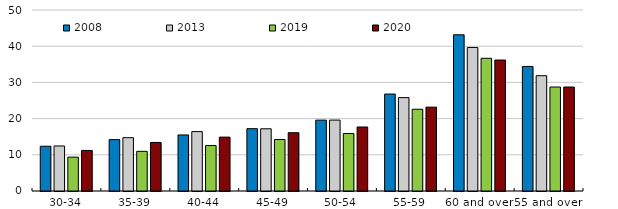
| Category | 2008 | 2013 | 2019 | 2020 |
|---|---|---|---|---|
| 30-34 | 12.366 | 12.436 | 9.356 | 11.207 |
| 35-39 | 14.199 | 14.731 | 10.954 | 13.415 |
| 40-44 | 15.48 | 16.412 | 12.554 | 14.887 |
| 45-49 | 17.217 | 17.185 | 14.221 | 16.104 |
| 50-54 | 19.575 | 19.586 | 15.886 | 17.682 |
| 55-59 | 26.782 | 25.797 | 22.587 | 23.168 |
| 60 and over | 43.157 | 39.651 | 36.661 | 36.178 |
| 55 and over | 34.409 | 31.852 | 28.723 | 28.723 |